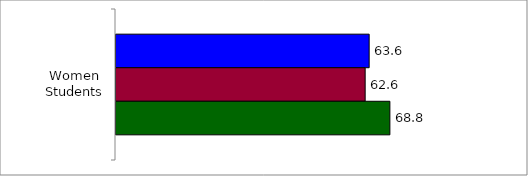
| Category | 50 States and D.C. | SREB States | State |
|---|---|---|---|
| Women Students | 63.611 | 62.605 | 68.815 |